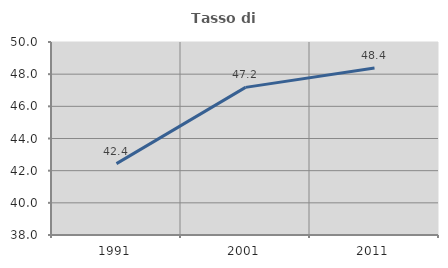
| Category | Tasso di occupazione   |
|---|---|
| 1991.0 | 42.439 |
| 2001.0 | 47.178 |
| 2011.0 | 48.383 |